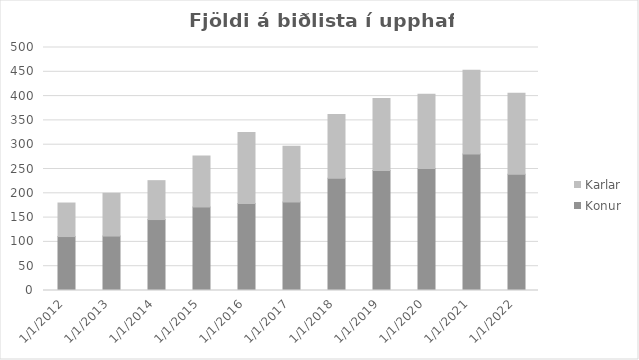
| Category | Konur | Karlar |
|---|---|---|
| 1/1/12 | 111 | 69 |
| 1/1/13 | 112 | 88 |
| 1/1/14 | 146 | 80 |
| 1/1/15 | 172 | 105 |
| 1/1/16 | 179 | 146 |
| 1/1/17 | 182 | 115 |
| 1/1/18 | 231 | 131 |
| 1/1/19 | 247 | 148 |
| 1/1/20 | 251 | 153 |
| 1/1/21 | 281 | 172 |
| 1/1/22 | 239 | 167 |